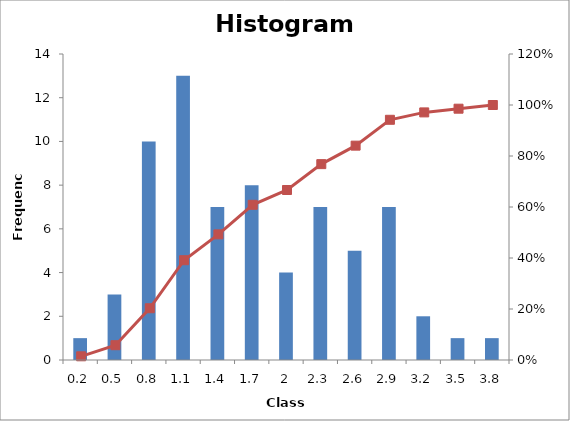
| Category | Frequenza |
|---|---|
| 0.2 | 1 |
| 0.5 | 3 |
| 0.8 | 10 |
| 1.1 | 13 |
| 1.4000000000000001 | 7 |
| 1.7000000000000002 | 8 |
| 2.0 | 4 |
| 2.3 | 7 |
| 2.5999999999999996 | 5 |
| 2.8999999999999995 | 7 |
| 3.1999999999999993 | 2 |
| 3.499999999999999 | 1 |
| 3.799999999999999 | 1 |